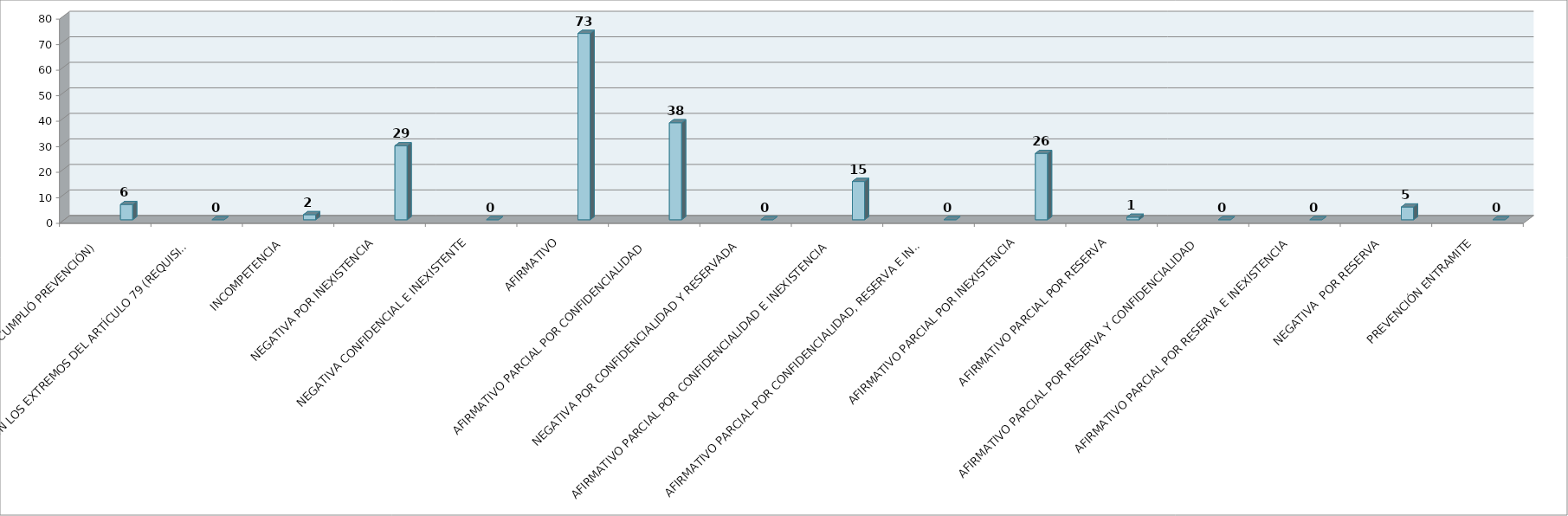
| Category | Series 0 | Series 1 | Series 2 | Series 3 | Series 4 | Series 5 |
|---|---|---|---|---|---|---|
| SE TIENE POR NO PRESENTADA ( NO CUMPLIÓ PREVENCIÓN) |  |  |  |  | 6 |  |
| NO CUMPLIO CON LOS EXTREMOS DEL ARTÍCULO 79 (REQUISITOS) |  |  |  |  | 0 |  |
| INCOMPETENCIA  |  |  |  |  | 2 |  |
| NEGATIVA POR INEXISTENCIA |  |  |  |  | 29 |  |
| NEGATIVA CONFIDENCIAL E INEXISTENTE |  |  |  |  | 0 |  |
| AFIRMATIVO |  |  |  |  | 73 |  |
| AFIRMATIVO PARCIAL POR CONFIDENCIALIDAD  |  |  |  |  | 38 |  |
| NEGATIVA POR CONFIDENCIALIDAD Y RESERVADA |  |  |  |  | 0 |  |
| AFIRMATIVO PARCIAL POR CONFIDENCIALIDAD E INEXISTENCIA |  |  |  |  | 15 |  |
| AFIRMATIVO PARCIAL POR CONFIDENCIALIDAD, RESERVA E INEXISTENCIA |  |  |  |  | 0 |  |
| AFIRMATIVO PARCIAL POR INEXISTENCIA |  |  |  |  | 26 |  |
| AFIRMATIVO PARCIAL POR RESERVA |  |  |  |  | 1 |  |
| AFIRMATIVO PARCIAL POR RESERVA Y CONFIDENCIALIDAD |  |  |  |  | 0 |  |
| AFIRMATIVO PARCIAL POR RESERVA E INEXISTENCIA |  |  |  |  | 0 |  |
| NEGATIVA  POR RESERVA |  |  |  |  | 5 |  |
| PREVENCIÓN ENTRAMITE |  |  |  |  | 0 |  |